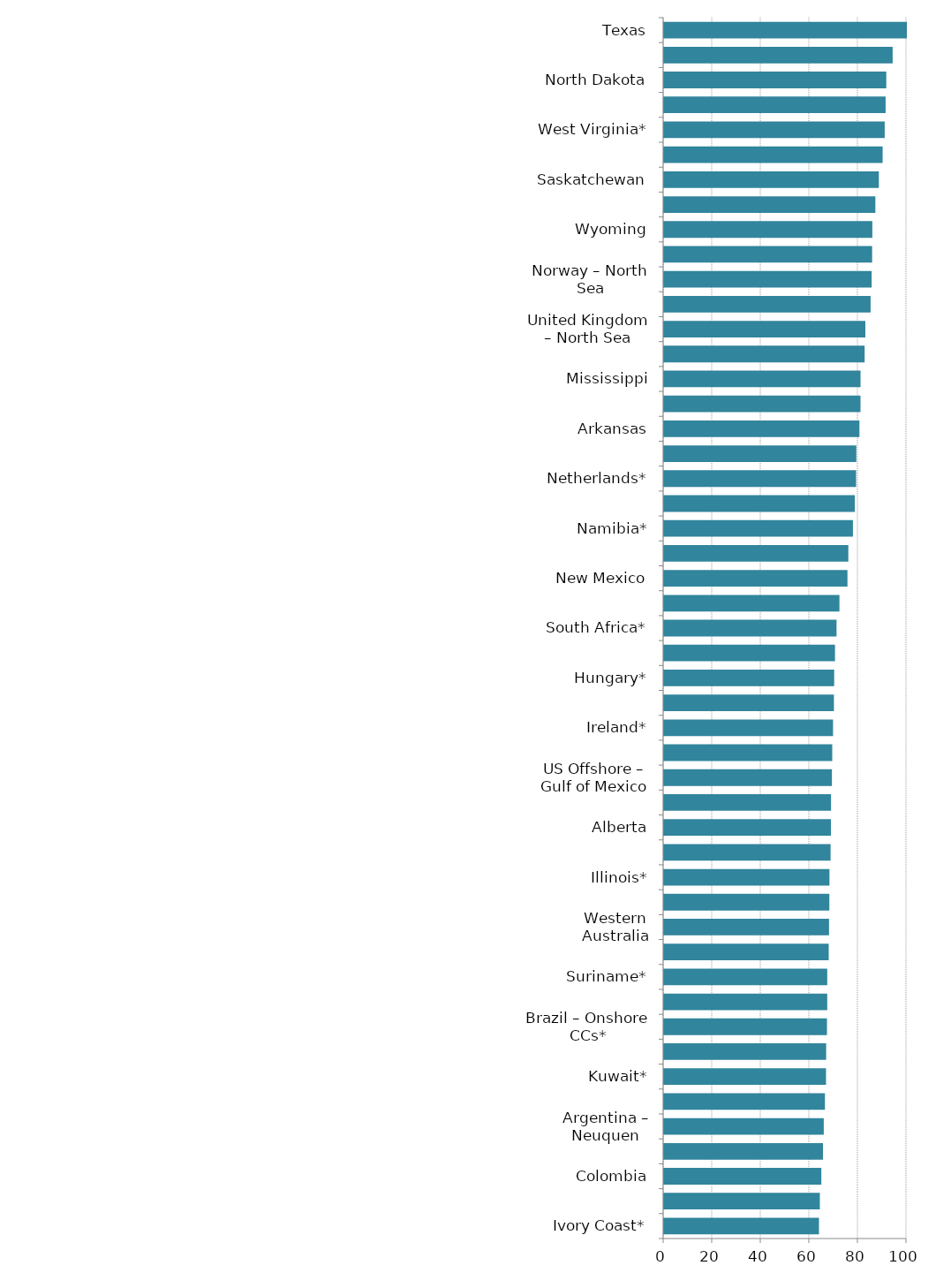
| Category | PPI Score |
|---|---|
| Ivory Coast* | 63.801 |
| Guyana* | 64.169 |
| Colombia | 64.779 |
| Egypt | 65.454 |
| Argentina – Neuquen | 65.781 |
| Tunisia | 66.267 |
| Kuwait* | 66.707 |
| Equatorial Guinea | 66.757 |
| Brazil – Onshore CCs* | 67.1 |
| Brunei* | 67.21 |
| Suriname* | 67.213 |
| Australia – Offshore | 67.824 |
| Western Australia | 67.952 |
| Thailand | 68.071 |
| Illinois* | 68.121 |
| Ghana | 68.589 |
| Alberta | 68.728 |
| Pennsylvania | 68.773 |
| US Offshore – Gulf of Mexico | 69.14 |
| Oman* | 69.274 |
| Ireland* | 69.601 |
| Utah* | 69.964 |
| Hungary* | 70.07 |
| Nova Scotia* | 70.406 |
| South Africa* | 71.034 |
| Alabama* | 72.233 |
| New Mexico | 75.541 |
| UK – Other Offshore (ex. Nth. Sea)* | 75.899 |
| Namibia* | 77.788 |
| Louisiana | 78.557 |
| Netherlands* | 79.09 |
| Montana | 79.188 |
| Arkansas | 80.47 |
| United Arab Emirates | 80.911 |
| Mississippi | 80.926 |
| New Zealand | 82.609 |
| United Kingdom – North Sea | 82.904 |
| Manitoba | 85.06 |
| Norway – North Sea | 85.495 |
| South Australia | 85.696 |
| Wyoming | 85.786 |
| Norway – Other Offshore (ex. Nth. Sea)* | 87.028 |
| Saskatchewan | 88.466 |
| Kansas | 90.017 |
| West Virginia* | 90.881 |
| Newfoundland & Labrador* | 91.249 |
| North Dakota | 91.525 |
| Oklahoma | 94.145 |
| Texas | 100 |